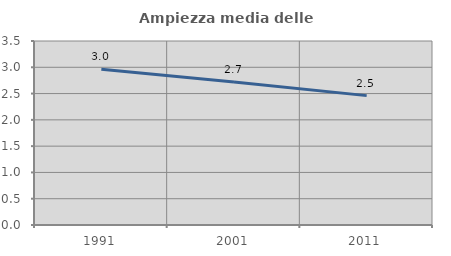
| Category | Ampiezza media delle famiglie |
|---|---|
| 1991.0 | 2.961 |
| 2001.0 | 2.72 |
| 2011.0 | 2.461 |